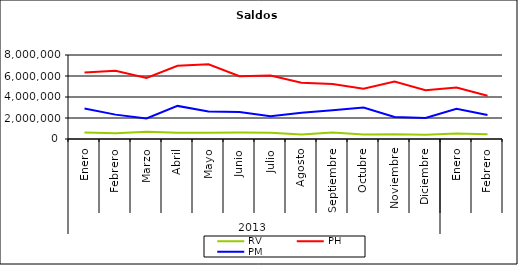
| Category | RV | PH | PM |
|---|---|---|---|
| 0 | 625726.624 | 6338490.057 | 2894951.851 |
| 1 | 552164.14 | 6505711.807 | 2320902.81 |
| 2 | 684317.675 | 5822855.149 | 1948127.804 |
| 3 | 601474.166 | 6976391.987 | 3151453.143 |
| 4 | 590050.657 | 7107878.906 | 2620515.735 |
| 5 | 624993.58 | 5975534.656 | 2574055.31 |
| 6 | 600696.535 | 6050025.472 | 2173848.831 |
| 7 | 419012.816 | 5367684.924 | 2503871.717 |
| 8 | 611730.758 | 5247250.768 | 2727549.288 |
| 9 | 419155.215 | 4784420.625 | 2990459.774 |
| 10 | 447319.577 | 5481772.72 | 2092491.866 |
| 11 | 408611.698 | 4646492.747 | 1999878.157 |
| 12 | 527889.485 | 4912075.273 | 2877652.76 |
| 13 | 454567.098 | 4120538.063 | 2278357.683 |